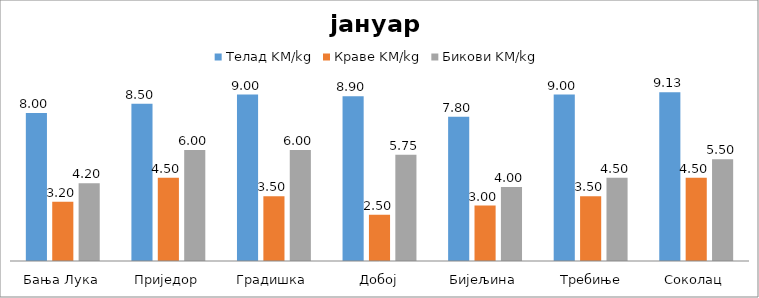
| Category | Телад KM/kg | Краве KM/kg | Бикови KM/kg |
|---|---|---|---|
| Бања Лука | 8 | 3.2 | 4.2 |
| Приједор | 8.5 | 4.5 | 6 |
| Градишка | 9 | 3.5 | 6 |
| Добој | 8.9 | 2.5 | 5.75 |
| Бијељина | 7.8 | 3 | 4 |
|  Требиње | 9 | 3.5 | 4.5 |
| Соколац | 9.125 | 4.5 | 5.5 |